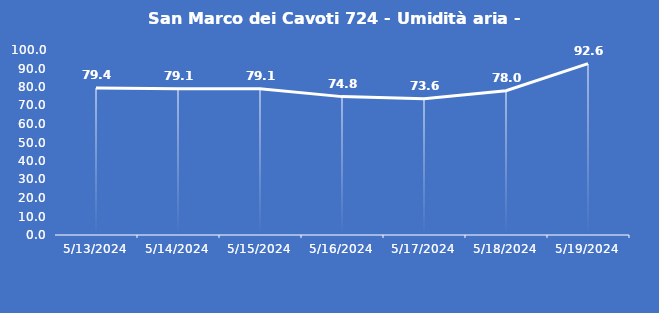
| Category | San Marco dei Cavoti 724 - Umidità aria - Grezzo (%) |
|---|---|
| 5/13/24 | 79.4 |
| 5/14/24 | 79.1 |
| 5/15/24 | 79.1 |
| 5/16/24 | 74.8 |
| 5/17/24 | 73.6 |
| 5/18/24 | 78 |
| 5/19/24 | 92.6 |